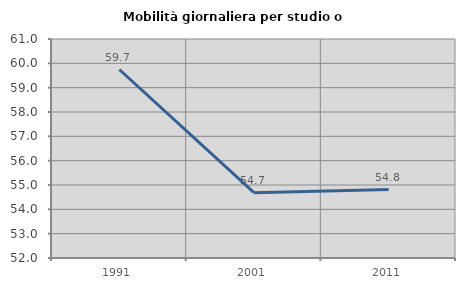
| Category | Mobilità giornaliera per studio o lavoro |
|---|---|
| 1991.0 | 59.746 |
| 2001.0 | 54.683 |
| 2011.0 | 54.813 |